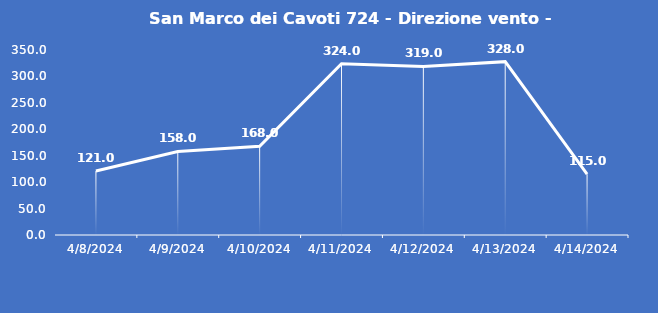
| Category | San Marco dei Cavoti 724 - Direzione vento - Grezzo (°N) |
|---|---|
| 4/8/24 | 121 |
| 4/9/24 | 158 |
| 4/10/24 | 168 |
| 4/11/24 | 324 |
| 4/12/24 | 319 |
| 4/13/24 | 328 |
| 4/14/24 | 115 |